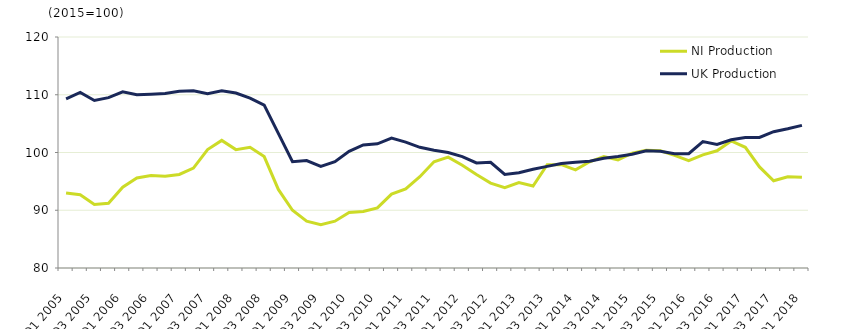
| Category | NI Production | UK Production |
|---|---|---|
| Q1 2005 | 93 | 109.3 |
|  | 92.7 | 110.4 |
| Q3 2005 | 91 | 109 |
|  | 91.2 | 109.5 |
| Q1 2006 | 94 | 110.5 |
|  | 95.6 | 110 |
| Q3 2006 | 96 | 110.1 |
|  | 95.9 | 110.2 |
| Q1 2007 | 96.2 | 110.6 |
|  | 97.3 | 110.7 |
| Q3 2007 | 100.5 | 110.2 |
|  | 102.1 | 110.7 |
| Q1 2008 | 100.5 | 110.3 |
|  | 100.9 | 109.4 |
| Q3 2008 | 99.3 | 108.2 |
|  | 93.6 | 103.3 |
| Q1 2009 | 90 | 98.4 |
|  | 88.1 | 98.6 |
| Q3 2009 | 87.5 | 97.6 |
|  | 88.1 | 98.4 |
| Q1 2010 | 89.6 | 100.2 |
|  | 89.8 | 101.3 |
| Q3 2010 | 90.4 | 101.5 |
|  | 92.8 | 102.5 |
| Q1 2011 | 93.7 | 101.8 |
|  | 95.8 | 100.9 |
| Q3 2011 | 98.4 | 100.4 |
|  | 99.2 | 100 |
| Q1 2012 | 97.8 | 99.3 |
|  | 96.2 | 98.2 |
| Q3 2012 | 94.7 | 98.3 |
|  | 93.9 | 96.2 |
| Q1 2013 | 94.8 | 96.5 |
|  | 94.2 | 97.1 |
| Q3 2013 | 97.9 | 97.6 |
|  | 97.9 | 98.1 |
| Q1 2014 | 97 | 98.3 |
|  | 98.4 | 98.5 |
| Q3 2014 | 99.3 | 99 |
|  | 98.7 | 99.3 |
| Q1 2015 | 99.9 | 99.7 |
|  | 100.4 | 100.3 |
| Q3 2015 | 100.3 | 100.2 |
|  | 99.5 | 99.8 |
| Q1 2016 | 98.6 | 99.8 |
|  | 99.6 | 101.9 |
| Q3 2016 | 100.3 | 101.4 |
|  | 102 | 102.2 |
| Q1 2017 | 100.9 | 102.6 |
|  | 97.5 | 102.6 |
| Q3 2017 | 95.1 | 103.6 |
|  | 95.8 | 104.1 |
| Q1 2018 | 95.7 | 104.7 |